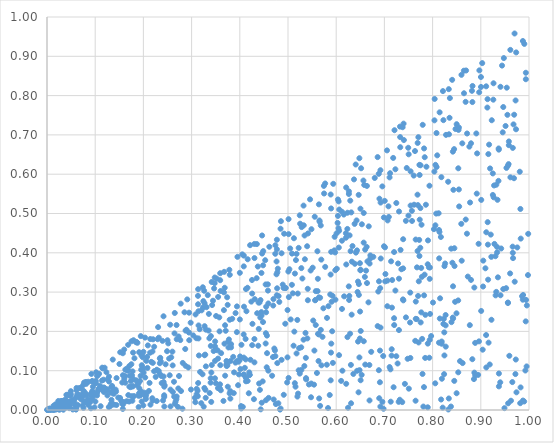
| Category | Series 0 |
|---|---|
| 0.17585475594027955 | 0.035 |
| 0.20507678289886366 | 0.028 |
| 0.17088042861835662 | 0.06 |
| 0.9156636879071182 | 0.651 |
| 0.6495525231396712 | 0.251 |
| 0.24174873788533002 | 0.238 |
| 0.15760879621630386 | 0.014 |
| 0.178538439021951 | 0.146 |
| 0.2945479355392524 | 0.197 |
| 0.10611918354474914 | 0.049 |
| 0.8245222405139797 | 0.139 |
| 0.7649676409569403 | 0.434 |
| 0.2084045037944593 | 0.107 |
| 0.5276578700279133 | 0.361 |
| 0.7904545625740234 | 0.432 |
| 0.049425836535346934 | 0.048 |
| 0.8042844530105199 | 0.791 |
| 0.8142375075098331 | 0.453 |
| 0.5619568089720112 | 0.334 |
| 0.430449681195083 | 0.387 |
| 0.8595130578470622 | 0.474 |
| 0.10056025559964044 | 0.068 |
| 0.43935150638860065 | 0.206 |
| 0.3774239110867569 | 0.18 |
| 0.35931175538141935 | 0.33 |
| 0.47358841606062185 | 0.398 |
| 0.9817645512064085 | 0.017 |
| 0.9338659723494305 | 0.401 |
| 0.7940328825141983 | 0.178 |
| 0.37234059753126325 | 0.125 |
| 0.11801280709090134 | 0.046 |
| 0.4799945296124317 | 0.017 |
| 0.8075376007803954 | 0.5 |
| 0.05348725140854438 | 0.001 |
| 0.41042445132431593 | 0.107 |
| 0.35797847699038343 | 0.2 |
| 0.09415366950676196 | 0.028 |
| 0.28742773690324175 | 0.113 |
| 0.9142654995987781 | 0.478 |
| 0.4417573572453436 | 0.051 |
| 0.3842812087172093 | 0.232 |
| 0.34887113404739645 | 0.174 |
| 0.1519109047912649 | 0.147 |
| 0.7834276409397374 | 0.344 |
| 0.6369083594803543 | 0.587 |
| 0.3606176417596294 | 0.05 |
| 0.9978827139546707 | 0.343 |
| 0.9608218395448732 | 0.347 |
| 0.4558493823691179 | 0.109 |
| 0.5554708736535731 | 0.492 |
| 0.6029480892905545 | 0.476 |
| 0.1351790285037905 | 0.017 |
| 0.6917976182112878 | 0.61 |
| 0.09102778998511052 | 0.037 |
| 0.8966314827719573 | 0.808 |
| 0.3863012273343548 | 0.135 |
| 0.13293082791299815 | 0.044 |
| 0.26846769598778253 | 0.028 |
| 0.9147558969945111 | 0.421 |
| 0.9614292486175763 | 0.592 |
| 0.2555262341435828 | 0.217 |
| 0.17853151664045652 | 0.061 |
| 0.10808522094797934 | 0.092 |
| 0.6480940511476083 | 0.641 |
| 0.5646327334087777 | 0.029 |
| 0.7389031452604073 | 0.435 |
| 0.6669460279867285 | 0.274 |
| 0.4762503805747399 | 0.378 |
| 0.061154532069425116 | 0.05 |
| 0.02991010120879012 | 0.013 |
| 0.5164854055365303 | 0.382 |
| 0.9454905520808745 | 0.707 |
| 0.8059769551954367 | 0.624 |
| 0.8082887951678888 | 0.618 |
| 0.9955306787486079 | 0.266 |
| 0.1503087237076257 | 0.117 |
| 0.6119882189890729 | 0.431 |
| 0.4805257890541087 | 0.29 |
| 0.8431730659499967 | 0.56 |
| 0.6208886316973377 | 0.37 |
| 0.7404091679326086 | 0.687 |
| 0.5011514594325427 | 0.486 |
| 0.6338168707461256 | 0.417 |
| 0.8532086736872075 | 0.096 |
| 0.3694413618128365 | 0.216 |
| 0.3081949213283517 | 0.243 |
| 0.813652366285127 | 0.386 |
| 0.6570296801284964 | 0.426 |
| 0.0466837504234513 | 0.022 |
| 0.3418986521620172 | 0.114 |
| 0.8171720897342785 | 0.44 |
| 0.7335678455416573 | 0.407 |
| 0.8145884965457878 | 0.757 |
| 0.9825584006171866 | 0.057 |
| 0.7323729055826986 | 0.721 |
| 0.9172272939741939 | 0.675 |
| 0.12534498771002978 | 0.037 |
| 0.8391769462579881 | 0.224 |
| 0.4563569560927534 | 0.189 |
| 0.6982285955645973 | 0.003 |
| 0.09630662544147861 | 0.037 |
| 0.7669372034566766 | 0.231 |
| 0.5208611356306349 | 0.042 |
| 0.16594030644134483 | 0.101 |
| 0.19155454425518847 | 0.055 |
| 0.793499841212566 | 0.571 |
| 0.9320886867248303 | 0.301 |
| 0.7091457113933748 | 0.491 |
| 0.9491187547674136 | 0.005 |
| 0.3478190829611205 | 0.323 |
| 0.40519981104700886 | 0.396 |
| 0.9366633264136909 | 0.583 |
| 0.06140003430863905 | 0.007 |
| 0.9924841927845444 | 0.101 |
| 0.0006564725284459172 | 0 |
| 0.35740634303185603 | 0.236 |
| 0.34863746885247526 | 0.125 |
| 0.6892862623774892 | 0.03 |
| 0.3790256162415083 | 0.23 |
| 0.091065726642926 | 0.004 |
| 0.7790840256562677 | 0.092 |
| 0.18572894497845638 | 0.173 |
| 0.49534148289241375 | 0.311 |
| 0.19648429686803304 | 0.022 |
| 0.4205644016668869 | 0.089 |
| 0.3748422384067749 | 0.267 |
| 0.15962306447218477 | 0.02 |
| 0.7713668589386432 | 0.327 |
| 0.20595084847771017 | 0.04 |
| 0.7283589959406082 | 0.373 |
| 0.4835450254101251 | 0.001 |
| 0.023483182084091947 | 0.023 |
| 0.6207321954856098 | 0.067 |
| 0.4463561634777484 | 0.398 |
| 0.5202290936484233 | 0.296 |
| 0.36957959371982574 | 0.087 |
| 0.08106994081725238 | 0.02 |
| 0.8036742995958402 | 0.607 |
| 0.376457973062966 | 0.159 |
| 0.9109920719500924 | 0.191 |
| 0.7752863145138251 | 0.223 |
| 0.9192450631257677 | 0.615 |
| 0.37828051846377886 | 0.357 |
| 0.6906978130865692 | 0.071 |
| 0.7699197616492727 | 0.29 |
| 0.17192734971840062 | 0.087 |
| 0.9552404917694952 | 0.751 |
| 0.6564605087229464 | 0.584 |
| 0.727416084756775 | 0.118 |
| 0.0444470102143073 | 0.02 |
| 0.07359358642793012 | 0.011 |
| 0.7228147620116585 | 0.304 |
| 0.6054097150306115 | 0.413 |
| 0.17951825489622686 | 0.078 |
| 0.7398101476179229 | 0.729 |
| 0.7327096012070123 | 0.694 |
| 0.3661126525068381 | 0.023 |
| 0.44089687162980096 | 0.274 |
| 0.17685674874553314 | 0.06 |
| 0.39711053515505323 | 0.123 |
| 0.44863755504947 | 0.404 |
| 0.23729481841576405 | 0.086 |
| 0.8054871253822756 | 0.068 |
| 0.476932077705048 | 0.433 |
| 0.4779686833256577 | 0.351 |
| 0.009854056831831381 | 0.002 |
| 0.8351280000852747 | 0.744 |
| 0.6423073278420621 | 0.482 |
| 0.6503054954934986 | 0.512 |
| 0.7872316980934521 | 0.619 |
| 0.6320842318112879 | 0.243 |
| 0.8816580443369463 | 0.812 |
| 0.3128570650264827 | 0.035 |
| 0.20379922664901207 | 0.083 |
| 0.8214616297846109 | 0.811 |
| 0.49417524273621105 | 0.31 |
| 0.44296588654633207 | 0.28 |
| 0.6637352483720654 | 0.57 |
| 0.84106671595996 | 0.375 |
| 0.8340100909777521 | 0.702 |
| 0.5748818747641056 | 0.551 |
| 0.9592183647254764 | 0.138 |
| 0.6908220603641153 | 0.151 |
| 0.4120462860079108 | 0.181 |
| 0.19975271336784894 | 0.012 |
| 0.06264261662667803 | 0.039 |
| 0.8828370980187168 | 0.824 |
| 0.909597117852992 | 0.361 |
| 0.6233196692747917 | 0.186 |
| 0.2611295391572668 | 0.046 |
| 0.8825248500988726 | 0.784 |
| 0.7651235825695318 | 0.276 |
| 0.5229532123178255 | 0.157 |
| 0.606098278329061 | 0.456 |
| 0.11915973278827063 | 0.057 |
| 0.6600667255988171 | 0.408 |
| 0.06001508325707183 | 0.031 |
| 0.1900297250145998 | 0.036 |
| 0.27388848184651426 | 0.086 |
| 0.7900243606737917 | 0.169 |
| 0.7151549350616836 | 0.155 |
| 0.41636718220425195 | 0.384 |
| 0.33532016417873134 | 0.202 |
| 0.4262583759297658 | 0.219 |
| 0.933324385686624 | 0.415 |
| 0.3134192211856187 | 0.269 |
| 0.0750707063210384 | 0.063 |
| 0.5613593403181595 | 0.303 |
| 0.5283980176887845 | 0.465 |
| 0.09338748306636802 | 0.073 |
| 0.03504833829273801 | 0.015 |
| 0.6443801874370518 | 0.3 |
| 0.2195786358815467 | 0.12 |
| 0.846680862397007 | 0.275 |
| 0.4434052501362158 | 0.002 |
| 0.6207134952422113 | 0.566 |
| 0.067973616243171 | 0.037 |
| 0.5028828472883423 | 0.358 |
| 0.17646083481502917 | 0.088 |
| 0.114105789944691 | 0.075 |
| 0.2687733177842677 | 0.216 |
| 0.5575893263574526 | 0.216 |
| 0.5486323648053583 | 0.46 |
| 0.5322326753722574 | 0.179 |
| 0.19115827492757897 | 0.147 |
| 0.2319769118724384 | 0.184 |
| 0.7532685109971216 | 0.223 |
| 0.14772806402480088 | 0.032 |
| 0.42205580736111104 | 0.128 |
| 0.9478337746171267 | 0.895 |
| 0.9538938602460018 | 0.82 |
| 0.39820595826542426 | 0.091 |
| 0.17064963690440504 | 0.112 |
| 0.5744373672270864 | 0.57 |
| 0.31358108241346894 | 0.069 |
| 0.5482423076449454 | 0.067 |
| 0.3520619931301502 | 0.334 |
| 0.5915918104869917 | 0.2 |
| 0.6619897458832047 | 0.355 |
| 0.8327108494138575 | 0.001 |
| 0.3613011170852155 | 0.145 |
| 0.7944436698491425 | 0.363 |
| 0.779487135982197 | 0.726 |
| 0.1364479635110727 | 0.128 |
| 0.3251339551027814 | 0.008 |
| 0.5540137367913232 | 0.064 |
| 0.8762499749072906 | 0.67 |
| 0.013591847904236065 | 0.011 |
| 0.4728928505090422 | 0.152 |
| 0.6050279527958399 | 0.531 |
| 0.6859795989837202 | 0.643 |
| 0.9730918924557073 | 0.714 |
| 0.5409692884665425 | 0.308 |
| 0.4716169497563666 | 0.156 |
| 0.5370297852465749 | 0.133 |
| 0.9114212970302984 | 0.108 |
| 0.5339387617972023 | 0.112 |
| 0.16533770816938287 | 0.022 |
| 0.3508321671469501 | 0.239 |
| 0.30772026032632493 | 0.02 |
| 0.7227934416241129 | 0.613 |
| 0.1604005615719183 | 0.079 |
| 0.10377744450781257 | 0.037 |
| 0.626406744015788 | 0.556 |
| 0.8278362412507015 | 0.7 |
| 0.3819162424930346 | 0.167 |
| 0.21389309204229745 | 0.146 |
| 0.45368263516120866 | 0.319 |
| 0.45468202963702464 | 0.263 |
| 0.36871269435036746 | 0.311 |
| 0.24415899780982098 | 0.063 |
| 0.37514681948249307 | 0.059 |
| 0.10678977482995444 | 0.054 |
| 0.5809041475158153 | 0.234 |
| 0.6506921049195311 | 0.076 |
| 0.2691550932760184 | 0.18 |
| 0.9950541442547483 | 0.111 |
| 0.10003405538400001 | 0.069 |
| 0.569108027414805 | 0.383 |
| 0.47613923096840927 | 0.345 |
| 0.09204577083697041 | 0.092 |
| 0.2577741214502973 | 0.134 |
| 0.9218286598378247 | 0.39 |
| 0.10043878228098135 | 0.022 |
| 0.7726882878476983 | 0.624 |
| 0.044356133336361236 | 0.039 |
| 0.6433838165234925 | 0.1 |
| 0.47778837391907436 | 0.119 |
| 0.16868845236988683 | 0.038 |
| 0.1980462058039013 | 0.109 |
| 0.892362337680719 | 0.653 |
| 0.30342090480876327 | 0.19 |
| 0.03237600563767684 | 0.01 |
| 0.5633792371533225 | 0.125 |
| 0.26547317073744103 | 0.016 |
| 0.8455278448220841 | 0.366 |
| 0.45917321700089586 | 0.271 |
| 0.5177323916882671 | 0.397 |
| 0.8715516684144593 | 0.704 |
| 0.7054041311295284 | 0.661 |
| 0.24202104363764754 | 0.071 |
| 0.7351762782086589 | 0.358 |
| 0.5967342873859681 | 0.441 |
| 0.8209299335278518 | 0.006 |
| 0.4354009868708726 | 0.422 |
| 0.08616464346447417 | 0.025 |
| 0.9613048335652788 | 0.916 |
| 0.25155572663539016 | 0.17 |
| 0.5680730347951323 | 0.204 |
| 0.9009220175465131 | 0.535 |
| 0.1878918649456286 | 0.07 |
| 0.8182233608084574 | 0.592 |
| 0.04919396243252705 | 0.02 |
| 0.8238829454132132 | 0.091 |
| 0.27656402111738676 | 0.178 |
| 0.395134881024527 | 0.39 |
| 0.49120840701469215 | 0.039 |
| 0.9873072062356968 | 0.939 |
| 0.19057012213492086 | 0.042 |
| 0.26073710124791527 | 0.113 |
| 0.19366806796319858 | 0.037 |
| 0.5221357803999839 | 0.412 |
| 0.7445891119953915 | 0.481 |
| 0.5143827631505906 | 0.347 |
| 0.8545308708080188 | 0.561 |
| 0.045316636109745234 | 0.009 |
| 0.8420342509370522 | 0.657 |
| 0.6466502547980147 | 0.547 |
| 0.9668878878078923 | 0.386 |
| 0.4788937978729272 | 0.36 |
| 0.7940055664477115 | 0.334 |
| 0.6860288633930001 | 0.213 |
| 0.06345980577813792 | 0.035 |
| 0.4866477150834505 | 0.399 |
| 0.27804660283408145 | 0.048 |
| 0.9373818071433183 | 0.662 |
| 0.5771568300131104 | 0.364 |
| 0.5885679674212366 | 0.075 |
| 0.04510628415644902 | 0.017 |
| 0.6639191385343708 | 0.323 |
| 0.3742221658025491 | 0.114 |
| 0.20484009215599985 | 0.034 |
| 0.9007989294551294 | 0.252 |
| 0.2278264961043317 | 0.102 |
| 0.8622979696736311 | 0.119 |
| 0.5830922387149846 | 0.005 |
| 0.04837596179973358 | 0.014 |
| 0.4083480017915011 | 0.393 |
| 0.537712741535875 | 0.078 |
| 0.07863922130920431 | 0.044 |
| 0.10194021971437539 | 0.096 |
| 0.6528296827453905 | 0.089 |
| 0.7727050583056791 | 0.392 |
| 0.6957133209326166 | 0.569 |
| 0.9938767518525485 | 0.28 |
| 0.3140887611020462 | 0.251 |
| 0.5011836887761774 | 0.082 |
| 0.6157533589718469 | 0.497 |
| 0.7860684703330817 | 0.522 |
| 0.1285893079623187 | 0.072 |
| 0.4670105403208995 | 0.087 |
| 0.5939126677212182 | 0.576 |
| 0.36021673762590944 | 0.303 |
| 0.5638926090360371 | 0.192 |
| 0.5434184553236227 | 0.065 |
| 0.37922196649403594 | 0.344 |
| 0.1959627688975506 | 0.139 |
| 0.9934767284674944 | 0.858 |
| 0.5013355946569765 | 0.448 |
| 0.8531006301792046 | 0.279 |
| 0.17044418006557338 | 0.022 |
| 0.706727886446311 | 0.482 |
| 0.6245766435557712 | 0.006 |
| 0.5876661517077747 | 0.294 |
| 0.041636153368287854 | 0.018 |
| 0.19290440448632262 | 0.074 |
| 0.5221790697243407 | 0.101 |
| 0.8335693503346497 | 0.816 |
| 0.6267716507771589 | 0.28 |
| 0.5895884043671163 | 0.402 |
| 0.08066157489255077 | 0.071 |
| 0.14237624729799292 | 0.052 |
| 0.9409009896642198 | 0.292 |
| 0.6912735621771073 | 0.31 |
| 0.9563030283239867 | 0.272 |
| 0.49075847516858795 | 0.311 |
| 0.0033104528008626177 | 0.001 |
| 0.4703863635918357 | 0.027 |
| 0.5523661092077796 | 0.228 |
| 0.4310640475372888 | 0.282 |
| 0.10408742224742451 | 0.087 |
| 0.897033255580955 | 0.864 |
| 0.9004410539808227 | 0.822 |
| 0.26389894215797105 | 0.034 |
| 0.1349915417726384 | 0.061 |
| 0.9403410756533737 | 0.07 |
| 0.35503550635964065 | 0.288 |
| 0.8449755160795875 | 0.074 |
| 0.48197255040847486 | 0.275 |
| 0.7687292574315178 | 0.548 |
| 0.5298499818064897 | 0.335 |
| 0.43024263577749045 | 0.422 |
| 0.7203395888586627 | 0.216 |
| 0.9002677904725194 | 0.847 |
| 0.11461528551429667 | 0.108 |
| 0.9051294261932344 | 0.38 |
| 0.0773488941083057 | 0.045 |
| 0.7573525916820198 | 0.481 |
| 0.21463913723382366 | 0.014 |
| 0.7182299310919698 | 0.641 |
| 0.09387129863816068 | 0.074 |
| 0.5981151081374356 | 0.356 |
| 0.2909916390157027 | 0.281 |
| 0.6231619667294984 | 0.461 |
| 0.9375789166619687 | 0.093 |
| 0.3670510163717434 | 0.254 |
| 0.9249853771224473 | 0.547 |
| 0.9220949198211604 | 0.23 |
| 0.8446299443568133 | 0.664 |
| 0.49907416099414914 | 0.254 |
| 0.9678561455386007 | 0.727 |
| 0.840560911586634 | 0.84 |
| 0.7615782643726039 | 0.522 |
| 0.8866780503675068 | 0.095 |
| 0.38039837381970165 | 0.048 |
| 0.5044923488033134 | 0.411 |
| 0.6572113961556759 | 0.175 |
| 0.47379535307120946 | 0.419 |
| 0.012356217485495868 | 0 |
| 0.20923729543770475 | 0.164 |
| 0.13181089296760695 | 0.01 |
| 0.018905825935579768 | 0.002 |
| 0.8418894586922456 | 0.235 |
| 0.9561903438576621 | 0.273 |
| 0.017709806552409835 | 0.014 |
| 0.8865751878382514 | 0.312 |
| 0.6991247930593705 | 0.417 |
| 0.7808449929762716 | 0.009 |
| 0.0854406652680112 | 0.013 |
| 0.38746791680811354 | 0.043 |
| 0.3097608051447369 | 0.183 |
| 0.5343608395739999 | 0.444 |
| 0.3409668850535327 | 0.095 |
| 0.7463696525534762 | 0.616 |
| 0.023565207832799473 | 0.013 |
| 0.8385993792604538 | 0.411 |
| 0.7481636934378983 | 0.13 |
| 0.5641488353809586 | 0.523 |
| 0.6693027936234363 | 0.373 |
| 0.971835114257354 | 0.091 |
| 0.017431579858058655 | 0.013 |
| 0.7378332754183082 | 0.72 |
| 0.03766654636225375 | 0.026 |
| 0.6278187666948668 | 0.444 |
| 0.4080227156346219 | 0.192 |
| 0.40873046849653427 | 0.263 |
| 0.6516594743571901 | 0.615 |
| 0.476678907122392 | 0.292 |
| 0.9689023765656252 | 0.59 |
| 0.6325828840001843 | 0.377 |
| 0.9206768897764489 | 0.446 |
| 0.1876614381517685 | 0.171 |
| 0.5414792212051823 | 0.449 |
| 0.2868211292608537 | 0.155 |
| 0.8424171099450366 | 0.315 |
| 0.32600054923571753 | 0.303 |
| 0.7689999635374652 | 0.68 |
| 0.12522862392367273 | 0.053 |
| 0.04242072415926934 | 0.038 |
| 0.6036042695684596 | 0.536 |
| 0.1794787396568589 | 0.178 |
| 0.9282704381233567 | 0.423 |
| 0.7303846594283849 | 0.505 |
| 0.4195956876157694 | 0.096 |
| 0.9932148552518236 | 0.226 |
| 0.07568756624188133 | 0.049 |
| 0.5977311288359622 | 0.401 |
| 0.6873203872674465 | 0.301 |
| 0.5657102485935597 | 0.479 |
| 0.3995135576407962 | 0.126 |
| 0.7061247291040933 | 0.264 |
| 0.5600342765649716 | 0.094 |
| 0.706319804803541 | 0.329 |
| 0.17502728439748727 | 0.116 |
| 0.8916203181400967 | 0.551 |
| 0.5865717699838036 | 0.038 |
| 0.8694628397864788 | 0.864 |
| 0.9375389096472447 | 0.06 |
| 0.2255451671601879 | 0.084 |
| 0.8358615998620681 | 0.794 |
| 0.5141828849902059 | 0.068 |
| 0.11334427718059614 | 0.053 |
| 0.03392352641436125 | 0.023 |
| 0.5177716381618742 | 0.144 |
| 0.3358212259315151 | 0.244 |
| 0.4474643535860725 | 0.073 |
| 0.4256934398734028 | 0.165 |
| 0.18969901875128659 | 0.071 |
| 0.6007623053366806 | 0.449 |
| 0.22949644563061855 | 0.18 |
| 0.20764907356268802 | 0.135 |
| 0.8149753080233968 | 0.233 |
| 0.9466345278793249 | 0.771 |
| 0.01968525873397209 | 0.007 |
| 0.7156391979972494 | 0.261 |
| 0.8907121419563443 | 0.704 |
| 0.3443970989370153 | 0.278 |
| 0.8884383991838123 | 0.088 |
| 0.08145636934918876 | 0.067 |
| 0.513148200431003 | 0.199 |
| 0.5363124532023147 | 0.196 |
| 0.9692210809645911 | 0.751 |
| 0.1942459477794619 | 0.087 |
| 0.1391530856722697 | 0.014 |
| 0.6305058119292165 | 0.115 |
| 0.28529303534010564 | 0.249 |
| 0.8132819545025034 | 0.458 |
| 0.9466055722214818 | 0.308 |
| 0.7016852102789269 | 0.327 |
| 0.13235380911108885 | 0.015 |
| 0.19012269691035577 | 0.007 |
| 0.7149516800360709 | 0.138 |
| 0.06838803019947437 | 0.031 |
| 0.3757693905853904 | 0.173 |
| 0.2395813427419673 | 0.176 |
| 0.6708876497292486 | 0.393 |
| 0.18144496349997707 | 0.132 |
| 0.7544006766391889 | 0.52 |
| 0.22003430593757767 | 0.18 |
| 0.11125721688886225 | 0.01 |
| 0.3466963903179344 | 0.309 |
| 0.08569054813536037 | 0.072 |
| 0.6463628822965215 | 0.045 |
| 0.11951714422948057 | 0.108 |
| 0.8231956268856754 | 0.232 |
| 0.5401622189556491 | 0.182 |
| 0.8475773566322677 | 0.715 |
| 0.37280429859561337 | 0.112 |
| 0.8537868505870677 | 0.713 |
| 0.7899667315428308 | 0.007 |
| 0.8797062277244078 | 0.331 |
| 0.7647025910639006 | 0.024 |
| 0.966369788199146 | 0.667 |
| 0.06700325715177058 | 0.056 |
| 0.9740100760115309 | 0.045 |
| 0.313554997554064 | 0.307 |
| 0.18742283388274805 | 0.062 |
| 0.989997013511282 | 0.022 |
| 0.5243560015902461 | 0.093 |
| 0.8883108371359364 | 0.171 |
| 0.2222286401206779 | 0.099 |
| 0.3593620434133745 | 0.348 |
| 0.45921124597256435 | 0.1 |
| 0.22771006151682227 | 0.023 |
| 0.9660820371343217 | 0.416 |
| 0.744711441765426 | 0.236 |
| 0.27175723204608304 | 0.008 |
| 0.5547460625730817 | 0.151 |
| 0.24907341388853033 | 0.15 |
| 0.4597494320789798 | 0.031 |
| 0.7570598112790111 | 0.507 |
| 0.22852143696771277 | 0.101 |
| 0.47485756054926975 | 0.015 |
| 0.7498986620437367 | 0.495 |
| 0.4581945260400653 | 0.32 |
| 0.6120112733057762 | 0.257 |
| 0.583894577408205 | 0.264 |
| 0.7688378614152814 | 0.405 |
| 0.8425658594848611 | 0.233 |
| 0.2545774881095827 | 0.088 |
| 0.6013091516437553 | 0.359 |
| 0.47377487474989055 | 0.137 |
| 0.29477284081114397 | 0.248 |
| 0.9346403678292141 | 0.535 |
| 0.8961790226314698 | 0.175 |
| 0.40626522985924296 | 0.008 |
| 0.6452433409339858 | 0.327 |
| 0.5322599472098113 | 0.52 |
| 0.310641865342671 | 0.054 |
| 0.18972620401336904 | 0.068 |
| 0.31238604012536997 | 0.049 |
| 0.3504084783222855 | 0.068 |
| 0.4688553321629153 | 0.135 |
| 0.5576630619590267 | 0.302 |
| 0.17753929738060192 | 0.098 |
| 0.3486736896474619 | 0.162 |
| 0.4373493800045176 | 0.365 |
| 0.4462285016390407 | 0.444 |
| 0.9423268213592183 | 0.411 |
| 0.6102527224217672 | 0.074 |
| 0.8270530802557456 | 0.215 |
| 0.32834352462860206 | 0.141 |
| 0.05669021071626945 | 0.021 |
| 0.4545650146986072 | 0.249 |
| 0.7201143819154658 | 0.402 |
| 0.8155216413846152 | 0.284 |
| 0.2188007002418867 | 0.149 |
| 0.021297808291138365 | 0.014 |
| 0.0746967713115374 | 0.041 |
| 0.18465598842787978 | 0.172 |
| 0.26454615522368685 | 0.195 |
| 0.7778031388110543 | 0.339 |
| 0.027894713943247496 | 0.02 |
| 0.1945698629121625 | 0.188 |
| 0.9576812106427632 | 0.626 |
| 0.3548109959052128 | 0.131 |
| 0.6691499707065004 | 0.024 |
| 0.9721970876781311 | 0.788 |
| 0.9047550898393673 | 0.314 |
| 0.20050970856013717 | 0.095 |
| 0.0016941514906931854 | 0.001 |
| 0.9756978533484005 | 0.414 |
| 0.8008363829718822 | 0.273 |
| 0.4031097778188817 | 0.004 |
| 0.019033992954856083 | 0.002 |
| 0.23623986263554309 | 0.123 |
| 0.0013448925277939061 | 0.001 |
| 0.8944783965292965 | 0.089 |
| 0.24998890028258847 | 0.177 |
| 0.2418623346525992 | 0.085 |
| 0.36714207898873474 | 0.299 |
| 0.5195301009703871 | 0.034 |
| 0.8648872661784952 | 0.863 |
| 0.4256726274045891 | 0.296 |
| 0.5251464279380288 | 0.474 |
| 0.5640925534546954 | 0.287 |
| 0.10486780384056882 | 0.088 |
| 0.40340961147802923 | 0.166 |
| 0.5412063891918472 | 0.279 |
| 0.7676262611004102 | 0.363 |
| 0.04841097409141726 | 0.036 |
| 0.000509960828505851 | 0 |
| 0.272430718062898 | 0.055 |
| 0.03695535006475037 | 0.024 |
| 0.9902898940785969 | 0.932 |
| 0.25619670209029866 | 0.052 |
| 0.21917517629246075 | 0.024 |
| 0.5193265515951911 | 0.229 |
| 0.688512413711993 | 0.101 |
| 0.7007318177697097 | 0.532 |
| 0.23391304739119323 | 0.092 |
| 0.006768457776431758 | 0.001 |
| 0.09522205816260776 | 0.059 |
| 0.3267519800195188 | 0.139 |
| 0.6975361524499443 | 0.137 |
| 0.8495786995703064 | 0.246 |
| 0.3206667274767173 | 0.254 |
| 0.6129042905446702 | 0.1 |
| 0.3740251842675707 | 0.118 |
| 0.3396095725776901 | 0.081 |
| 0.2980596742432249 | 0.222 |
| 0.9111056755043636 | 0.824 |
| 0.6882896966949136 | 0.601 |
| 0.29868233783958376 | 0.052 |
| 0.32959423787082753 | 0.111 |
| 0.5894209283988701 | 0.513 |
| 0.3287211878076709 | 0.051 |
| 0.13371703587490213 | 0.026 |
| 0.19539291724145846 | 0.102 |
| 0.785010361841334 | 0.242 |
| 0.9267087086275687 | 0.541 |
| 0.7319563069829749 | 0.026 |
| 0.5622885074844147 | 0.194 |
| 0.4891000200375204 | 0.319 |
| 0.3151825866767096 | 0.139 |
| 0.7931147521117873 | 0.133 |
| 0.39411829271601106 | 0.264 |
| 0.7969761710776788 | 0.188 |
| 0.6490392008604516 | 0.182 |
| 0.9304039806420441 | 0.391 |
| 0.6200566150922755 | 0.45 |
| 0.3243559616818641 | 0.277 |
| 0.561029856166193 | 0.404 |
| 0.16876270617838052 | 0.1 |
| 0.8187531137671229 | 0.169 |
| 0.0024910629984017385 | 0.002 |
| 0.2341286588689796 | 0.119 |
| 0.3398277095545045 | 0.163 |
| 0.2773559551952922 | 0.271 |
| 0.40254720953129886 | 0.01 |
| 0.34255763134101813 | 0.267 |
| 0.7898768557552919 | 0.371 |
| 0.4014346286077024 | 0.104 |
| 0.9653981476536592 | 0.071 |
| 0.8176637575834919 | 0.027 |
| 0.18519213387867062 | 0.076 |
| 0.8551226690740934 | 0.518 |
| 0.5898010711408932 | 0.169 |
| 0.08005255240930065 | 0.039 |
| 0.5570235007894502 | 0.28 |
| 0.8568899928287661 | 0.124 |
| 0.9184993759328158 | 0.116 |
| 0.4565349258688598 | 0.145 |
| 0.3199972468085267 | 0.017 |
| 0.1382672187496603 | 0.041 |
| 0.770456106114621 | 0.694 |
| 0.7139235630568347 | 0.378 |
| 0.958166202998866 | 0.674 |
| 0.6708009818117541 | 0.385 |
| 0.6404809757104314 | 0.625 |
| 0.014776014395650905 | 0 |
| 0.7749850448393424 | 0.623 |
| 0.9563056546489255 | 0.622 |
| 0.37374943957444917 | 0.287 |
| 0.3142996027892865 | 0.182 |
| 0.9113911038960613 | 0.452 |
| 0.4919605239664575 | 0.449 |
| 0.046271607083876676 | 0.013 |
| 0.3335587224773464 | 0.292 |
| 0.11734092014555708 | 0.077 |
| 0.4186358600607365 | 0.043 |
| 0.8954292361157166 | 0.423 |
| 0.8223956274764386 | 0.219 |
| 0.27303679342075193 | 0.187 |
| 0.0769396143230533 | 0.07 |
| 0.4989264888345585 | 0.134 |
| 0.5397134024591079 | 0.417 |
| 0.6571271276431373 | 0.501 |
| 0.993464733615305 | 0.842 |
| 0.24327890284028253 | 0.059 |
| 0.445516931785346 | 0.018 |
| 0.7948020416804118 | 0.244 |
| 0.40820855921598853 | 0.365 |
| 0.4005948573895187 | 0.136 |
| 0.8125240902336701 | 0.501 |
| 0.1441392900330687 | 0.013 |
| 0.710751253151875 | 0.592 |
| 0.11749743461703877 | 0.057 |
| 0.958223167449786 | 0.683 |
| 0.9135925159750252 | 0.77 |
| 0.8081034581552713 | 0.705 |
| 0.648162051432179 | 0.134 |
| 0.3168435994574377 | 0.206 |
| 0.5274540312945516 | 0.159 |
| 0.4943190201586142 | 0.219 |
| 0.4540876363510906 | 0.195 |
| 0.545727638526944 | 0.536 |
| 0.354761900500873 | 0.056 |
| 0.2874921503291443 | 0.202 |
| 0.3818272757242631 | 0.159 |
| 0.7731224657477574 | 0.598 |
| 0.13354927068228484 | 0.059 |
| 0.23405317246932533 | 0.131 |
| 0.6058983351103028 | 0.14 |
| 0.8858088606641796 | 0.079 |
| 0.2650955948911071 | 0.247 |
| 0.5056136124700787 | 0.23 |
| 0.8270326408843589 | 0.242 |
| 0.7608788776892964 | 0.596 |
| 0.3265311297677884 | 0.056 |
| 0.64704433537844 | 0.321 |
| 0.720964607727973 | 0.712 |
| 0.3479937086250017 | 0.337 |
| 0.29509907348650444 | 0.178 |
| 0.31762306050466904 | 0.097 |
| 0.9227722160289386 | 0.737 |
| 0.4159392530847902 | 0.311 |
| 0.4213504654961514 | 0.419 |
| 0.24608973110896015 | 0.116 |
| 0.3589776426918242 | 0.065 |
| 0.34573334112662446 | 0.15 |
| 0.4698060721865378 | 0.282 |
| 0.7302053825317959 | 0.334 |
| 0.6688389295276568 | 0.115 |
| 0.2634368576645635 | 0.072 |
| 0.03137478668461868 | 0.023 |
| 0.6452722092273625 | 0.174 |
| 0.508127879072436 | 0.319 |
| 0.0270923451045878 | 0.014 |
| 0.41223578815139916 | 0.129 |
| 0.6897163283271199 | 0.538 |
| 0.9808578765776615 | 0.606 |
| 0.5885601068387175 | 0.548 |
| 0.8651602723104878 | 0.806 |
| 0.7012894182262046 | 0.414 |
| 0.951375491359607 | 0.723 |
| 0.1683491959875455 | 0.166 |
| 0.3910386369454689 | 0.121 |
| 0.13482919373159563 | 0.045 |
| 0.8533020735509704 | 0.615 |
| 0.4203269959776016 | 0.089 |
| 0.7539186508184907 | 0.132 |
| 0.944070909917326 | 0.876 |
| 0.280986373078555 | 0.003 |
| 0.9259509474376765 | 0.79 |
| 0.9029412477690104 | 0.883 |
| 0.7384790138285232 | 0.281 |
| 0.509971890413676 | 0.297 |
| 0.33755378154082183 | 0.043 |
| 0.05823335303432564 | 0.012 |
| 0.48470259805558213 | 0.004 |
| 0.47698481035593243 | 0.409 |
| 0.08227115585853939 | 0.039 |
| 0.7709988103219197 | 0.172 |
| 0.8192794512388407 | 0.08 |
| 0.43889262849852473 | 0.273 |
| 0.1622085003849908 | 0.086 |
| 0.19741455582872014 | 0.143 |
| 0.5652018476695154 | 0.482 |
| 0.8096401124268533 | 0.648 |
| 0.6119462827550691 | 0.504 |
| 0.4612967374110455 | 0.415 |
| 0.6594632667106116 | 0.339 |
| 0.7126103392627864 | 0.103 |
| 0.9877828125539296 | 0.293 |
| 0.005668188676346886 | 0.004 |
| 0.06123789639632471 | 0.056 |
| 0.8797023260535258 | 0.679 |
| 0.07012638688964412 | 0.056 |
| 0.7083914989890576 | 0.518 |
| 0.9871528340938914 | 0.281 |
| 0.07647117336885945 | 0.022 |
| 0.8712590034674824 | 0.449 |
| 0.7744824244830176 | 0.413 |
| 0.6988952279241917 | 0.49 |
| 0.6916453033999945 | 0.009 |
| 0.7393537255388363 | 0.279 |
| 0.877212096270485 | 0.216 |
| 0.913996289146786 | 0.791 |
| 0.9734074012819331 | 0.91 |
| 0.01582659828709243 | 0.002 |
| 0.6271793199816249 | 0.29 |
| 0.5771659811150559 | 0.576 |
| 0.16250186632480912 | 0.069 |
| 0.6387256846382164 | 0.372 |
| 0.8260231220767695 | 0.373 |
| 0.20274992185350582 | 0.038 |
| 0.7923019780765352 | 0.363 |
| 0.15737544690919192 | 0.144 |
| 0.6164928774573933 | 0.289 |
| 0.06711963767947016 | 0.033 |
| 0.6921557079505456 | 0.528 |
| 0.8824257064072119 | 0.129 |
| 0.33685663088015216 | 0.182 |
| 0.14430168144529432 | 0.081 |
| 0.3269251764205615 | 0.271 |
| 0.4001161759864207 | 0.23 |
| 0.4542369091556422 | 0.025 |
| 0.25624324486974825 | 0.009 |
| 0.5017557585202024 | 0.287 |
| 0.38064416198456974 | 0.125 |
| 0.4866552978248073 | 0.128 |
| 0.00454065679236848 | 0.003 |
| 0.4137830649632048 | 0.251 |
| 0.711807407914286 | 0.602 |
| 0.5155806730235507 | 0.059 |
| 0.6288321626952862 | 0.194 |
| 0.8451836871789055 | 0.412 |
| 0.6381752268698585 | 0.474 |
| 0.42394306158387696 | 0.276 |
| 0.7650593637497881 | 0.232 |
| 0.6299137030866021 | 0.404 |
| 0.4360471561928465 | 0.246 |
| 0.8498129491478761 | 0.043 |
| 0.5007163838885622 | 0.352 |
| 0.38041181878059094 | 0.029 |
| 0.7823138442559363 | 0.666 |
| 0.537365824135401 | 0.081 |
| 0.9828633348578454 | 0.436 |
| 0.44481921964609317 | 0.249 |
| 0.7329143723262198 | 0.669 |
| 0.6631657114808617 | 0.415 |
| 0.23798261054577252 | 0.069 |
| 0.4253120389392322 | 0.331 |
| 0.21424472479088097 | 0.181 |
| 0.9525697194618641 | 0.31 |
| 0.1986616626525881 | 0.134 |
| 0.24325615628556485 | 0.033 |
| 0.438278676334529 | 0.164 |
| 0.43031080908659847 | 0.181 |
| 0.5884618142809278 | 0.345 |
| 0.7770472713279074 | 0.471 |
| 0.6582102726597349 | 0.573 |
| 0.8038672477715377 | 0.737 |
| 0.09384463008618504 | 0.048 |
| 0.7370053167682294 | 0.02 |
| 0.026144649744992754 | 0.01 |
| 0.6233424955921182 | 0.502 |
| 0.45843574413803145 | 0.304 |
| 0.7733061003432365 | 0.484 |
| 0.9566860291778324 | 0.017 |
| 0.005480986204837057 | 0 |
| 0.9275373683720637 | 0.571 |
| 0.6047475626641403 | 0.463 |
| 0.3394550181231829 | 0.07 |
| 0.1282967607639145 | 0.008 |
| 0.31445208299639693 | 0.215 |
| 0.08420430772774856 | 0.027 |
| 0.9856042571773524 | 0.29 |
| 0.19872750383201765 | 0.103 |
| 0.859897639114677 | 0.853 |
| 0.26018268264935773 | 0.149 |
| 0.2816886434979863 | 0.12 |
| 0.10076983110579707 | 0.069 |
| 0.1433090671049514 | 0.047 |
| 0.4425444392054855 | 0.235 |
| 0.07569389812448757 | 0.005 |
| 0.6887716527801461 | 0.327 |
| 0.201617682000363 | 0.044 |
| 0.15401915021891965 | 0.023 |
| 0.5561714156656167 | 0.279 |
| 0.5715820358288871 | 0.186 |
| 0.12580428797002474 | 0.078 |
| 0.4451927064721375 | 0.241 |
| 0.3132269331306543 | 0.29 |
| 0.7634933508370156 | 0.659 |
| 0.6484531358436139 | 0.101 |
| 0.8380487720407042 | 0.009 |
| 0.3681925640950914 | 0.169 |
| 0.3296956198912555 | 0.204 |
| 0.7765516776695598 | 0.248 |
| 0.15603780523808142 | 0.017 |
| 0.8322170456643735 | 0.581 |
| 0.2433940612719614 | 0.009 |
| 0.5891959893136031 | 0.146 |
| 0.3721078099858225 | 0.115 |
| 0.7131262299134687 | 0.021 |
| 0.39390902058287647 | 0.198 |
| 0.6603055601873639 | 0.116 |
| 0.9725871613126781 | 0.128 |
| 0.4483541823812204 | 0.368 |
| 0.21850203992458106 | 0.03 |
| 0.6726236959951115 | 0.148 |
| 0.8027445419955597 | 0.46 |
| 0.03388096720037925 | 0.001 |
| 0.11544212093985717 | 0.056 |
| 0.9874444983641467 | 0.024 |
| 0.5350623063331833 | 0.384 |
| 0.1286488332020046 | 0.085 |
| 0.7161375242702686 | 0.331 |
| 0.6532852567136178 | 0.473 |
| 0.6770237105383308 | 0.39 |
| 0.724754187943047 | 0.527 |
| 0.9700439312307576 | 0.958 |
| 0.5278178919288106 | 0.102 |
| 0.17705041527708676 | 0.023 |
| 0.4349666586096159 | 0.335 |
| 0.12325719884385755 | 0.096 |
| 0.8546652676722054 | 0.719 |
| 0.8272686172651789 | 0.161 |
| 0.2000387049638056 | 0.148 |
| 0.3269804362703661 | 0.213 |
| 0.9355153952759065 | 0.338 |
| 0.7845738735907296 | 0.133 |
| 0.34849670326491233 | 0.081 |
| 0.5083583133909508 | 0.398 |
| 0.0738778500346512 | 0.034 |
| 0.8685476705490321 | 0.784 |
| 0.8224496047044936 | 0.738 |
| 0.7695191385154487 | 0.521 |
| 0.7783014778714696 | 0.181 |
| 0.10962788001551427 | 0.062 |
| 0.04967639577011862 | 0.04 |
| 0.2058638061399426 | 0.125 |
| 0.26675413653463353 | 0.021 |
| 0.21147839637572385 | 0.048 |
| 0.008655465202869972 | 0.001 |
| 0.8336071683901272 | 0.029 |
| 0.6313136758868962 | 0.503 |
| 0.9983226472969523 | 0.448 |
| 0.3912104003271252 | 0.247 |
| 0.4128139386407019 | 0.308 |
| 0.017876514447907943 | 0.005 |
| 0.6063266055795706 | 0.51 |
| 0.5694173727166804 | 0.114 |
| 0.10386242775428167 | 0.044 |
| 0.7821292891721496 | 0.058 |
| 0.16466622070739545 | 0.105 |
| 0.34989402269467285 | 0.153 |
| 0.8246457547775566 | 0.366 |
| 0.03869074335730427 | 0.006 |
| 0.07072721817434013 | 0.027 |
| 0.7823228986771034 | 0.292 |
| 0.4449264369218201 | 0.349 |
| 0.44006439258397323 | 0.067 |
| 0.5512224075766305 | 0.362 |
| 0.09108451706602794 | 0.041 |
| 0.3964223643942296 | 0.063 |
| 0.09857320191440577 | 0.007 |
| 0.7108556224744558 | 0.109 |
| 0.8615938109364064 | 0.678 |
| 0.5666240184534215 | 0.286 |
| 0.10131217563989148 | 0.074 |
| 0.9626150011143532 | 0.024 |
| 0.4082525873170251 | 0.133 |
| 0.45368726315970387 | 0.169 |
| 0.022221237330203536 | 0.002 |
| 0.5469245214022107 | 0.355 |
| 0.04056868478659115 | 0.023 |
| 0.4303488536982115 | 0.121 |
| 0.4853346524931813 | 0.48 |
| 0.31042938357639527 | 0.04 |
| 0.3708062173414879 | 0.202 |
| 0.49820509058984075 | 0.07 |
| 0.7543813971104532 | 0.607 |
| 0.19658548773052087 | 0.114 |
| 0.47743110712936987 | 0.31 |
| 0.34075139729778614 | 0.021 |
| 0.719074906647896 | 0.058 |
| 0.3227002628348872 | 0.091 |
| 0.5806138168428568 | 0.115 |
| 0.1730285144631084 | 0.058 |
| 0.05328227179784151 | 0.026 |
| 0.9161420234556122 | 0.171 |
| 0.6647983626698638 | 0.378 |
| 0.6431790404740072 | 0.406 |
| 0.6409398581283867 | 0.4 |
| 0.5326987506269619 | 0.47 |
| 0.16250541024582132 | 0.102 |
| 0.9370724829756281 | 0.665 |
| 0.41278404148957926 | 0.073 |
| 0.06661798850768286 | 0.038 |
| 0.06372999691907799 | 0.013 |
| 0.17397881799284654 | 0.074 |
| 0.3310837135704562 | 0.262 |
| 0.4000822038567172 | 0.349 |
| 0.7536492713939592 | 0.299 |
| 0.6508959523824012 | 0.201 |
| 0.32924729158264165 | 0.031 |
| 0.4127614063266094 | 0.081 |
| 0.86039993373396 | 0.38 |
| 0.4693428610907662 | 0.266 |
| 0.04018648773738043 | 0.039 |
| 0.6036111474133834 | 0.494 |
| 0.6262666110244293 | 0.55 |
| 0.7296299880882282 | 0.021 |
| 0.9821537930197493 | 0.512 |
| 0.079473838535704 | 0.02 |
| 0.8188708985654428 | 0.174 |
| 0.512323983376699 | 0.437 |
| 0.930749147118427 | 0.292 |
| 0.44819486047198287 | 0.224 |
| 0.3585611585663384 | 0.055 |
| 0.4845276367738838 | 0.461 |
| 0.08978583328935397 | 0.02 |
| 0.7722283000993027 | 0.433 |
| 0.06024161677246387 | 0.001 |
| 0.5905257391147787 | 0.275 |
| 0.7494397671006743 | 0.667 |
| 0.6919774914637987 | 0.21 |
| 0.4527124136848223 | 0.381 |
| 0.6501668153008623 | 0.356 |
| 0.6675134435515169 | 0.467 |
| 0.8242750604010557 | 0.198 |
| 0.7503579149424487 | 0.651 |
| 0.25336988900356405 | 0.131 |
| 0.9532302073272264 | 0.616 |
| 0.021874544494671855 | 0.008 |
| 0.6799447119174549 | 0.59 |
| 0.029023640839463405 | 0.023 |
| 0.5924721148278816 | 0.291 |
| 0.5733728748749544 | 0.259 |
| 0.2932444755157648 | 0.108 |
| 0.2127694721215745 | 0.069 |
| 0.7836645806856849 | 0.643 |
| 0.028073969026717105 | 0.017 |
| 0.6260981964367924 | 0.315 |
| 0.8057912295645939 | 0.47 |
| 0.970365661020499 | 0.326 |
| 0.5477978602253253 | 0.032 |
| 0.24312515652775746 | 0.037 |
| 0.004674291165685629 | 0.002 |
| 0.2690789961839507 | 0.034 |
| 0.7639880793674154 | 0.176 |
| 0.8132258841888015 | 0.171 |
| 0.7021642258471561 | 0.346 |
| 0.32362140162715036 | 0.261 |
| 0.8687443343963916 | 0.485 |
| 0.13845758551699594 | 0.052 |
| 0.7506938987454188 | 0.054 |
| 0.598428815191361 | 0.281 |
| 0.23502476292406538 | 0.133 |
| 0.19460226708644468 | 0.048 |
| 0.23053078270379312 | 0.211 |
| 0.04613986645205348 | 0.005 |
| 0.5679957475461138 | 0.47 |
| 0.8730963475273392 | 0.339 |
| 0.7201100698074068 | 0.234 |
| 0.30681754874927913 | 0.031 |
| 0.1155509215480357 | 0.106 |
| 0.09489847527725903 | 0.047 |
| 0.69242990280871 | 0.385 |
| 0.40769173303143236 | 0.09 |
| 0.5666579104621043 | 0.01 |
| 0.8499203101931048 | 0.727 |
| 0.73889167978216 | 0.36 |
| 0.9151766741005105 | 0.332 |
| 0.3881392305344741 | 0.096 |
| 0.32326054426973017 | 0.312 |
| 0.6492336136077007 | 0.374 |
| 0.6291831866396655 | 0.533 |
| 0.2894310302330394 | 0.204 |
| 0.7746951615206842 | 0.514 |
| 0.2407515313039592 | 0.024 |
| 0.7301888681226087 | 0.203 |
| 0.6203111006110408 | 0.438 |
| 0.9322266498956723 | 0.573 |
| 0.7763519875644678 | 0.361 |
| 0.18050932226491367 | 0.035 |
| 0.1573262011021611 | 0.003 |
| 0.9039171302059237 | 0.153 |
| 0.3675245065477366 | 0.352 |
| 0.1752725047780178 | 0.175 |
| 0.5931047897377075 | 0.12 |
| 0.21619382968325607 | 0.122 |
| 0.8777320436665006 | 0.528 |
| 0.5244304257890654 | 0.495 |
| 0.15610440526561253 | 0.07 |
| 0.34175324597467216 | 0.326 |
| 0.7424961343869035 | 0.066 |
| 0.940822215935807 | 0.822 |
| 0.6470467576733009 | 0.293 |
| 0.4163034291008523 | 0.074 |
| 0.6356250932942095 | 0.092 |
| 0.15157581141788212 | 0.031 |
| 0.9264078838282482 | 0.831 |
| 0.02569960975440666 | 0.001 |
| 0.16015353099932272 | 0.154 |
| 0.15743165569867812 | 0.089 |
| 0.96638546041196 | 0.4 |
| 0.6958270319242733 | 0.021 |
| 0.22235577185642807 | 0.161 |
| 0.6308489165967608 | 0.017 |
| 0.6506234428614861 | 0.357 |
| 0.3595694087216248 | 0.114 |
| 0.9249212396085176 | 0.602 |
| 0.39495130895418695 | 0.125 |
| 0.12452224504950804 | 0.05 |
| 0.5961866528290344 | 0.406 |
| 0.34003208807009155 | 0.188 |
| 0.40860296194279233 | 0.09 |
| 0.7247392490027967 | 0.137 |
| 0.5115566122974696 | 0.164 |
| 0.4293057556425909 | 0.028 |
| 0.014214960422509026 | 0.007 |
| 0.23176591703247873 | 0.1 |
| 0.20341530971363075 | 0.184 |
| 0.3788816281370413 | 0.042 |
| 0.3539318489675286 | 0.152 |